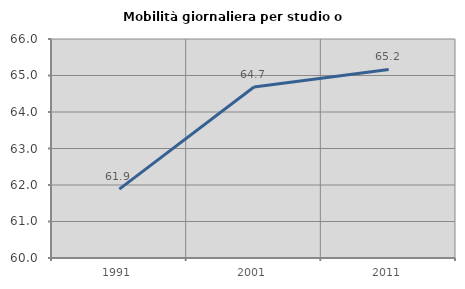
| Category | Mobilità giornaliera per studio o lavoro |
|---|---|
| 1991.0 | 61.887 |
| 2001.0 | 64.683 |
| 2011.0 | 65.166 |